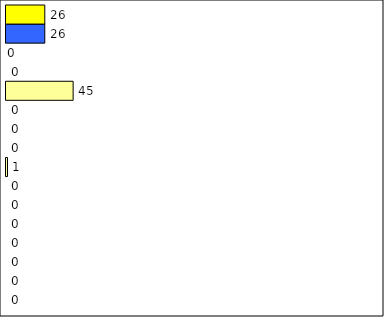
| Category | -2 | -1 | 0 | 1 | 2 | 3 | 4 | 5 | 6 | 7 | 8 | 9 | 10 | 11 | 12 | Perfect Round |
|---|---|---|---|---|---|---|---|---|---|---|---|---|---|---|---|---|
| 0 | 0 | 0 | 0 | 0 | 0 | 0 | 0 | 1 | 0 | 0 | 0 | 45 | 0 | 0 | 26 | 26 |